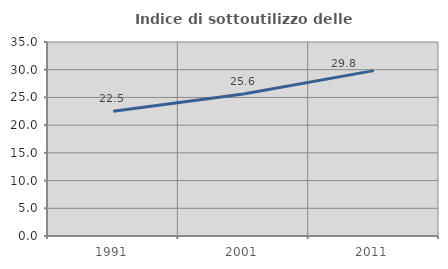
| Category | Indice di sottoutilizzo delle abitazioni  |
|---|---|
| 1991.0 | 22.486 |
| 2001.0 | 25.615 |
| 2011.0 | 29.838 |